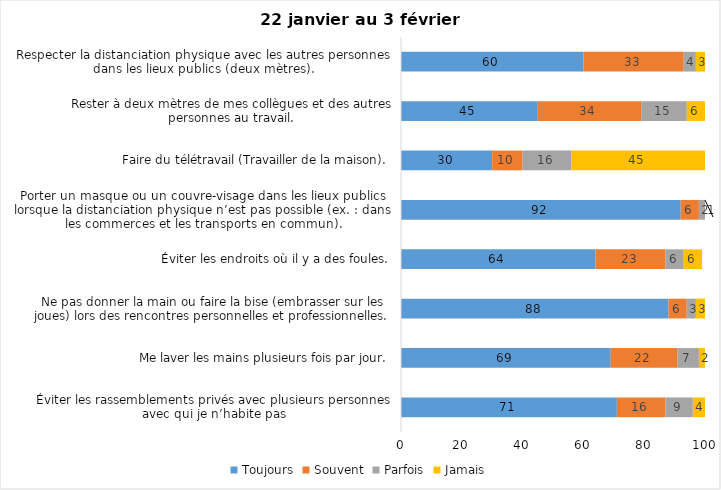
| Category | Toujours | Souvent | Parfois | Jamais |
|---|---|---|---|---|
| Éviter les rassemblements privés avec plusieurs personnes avec qui je n’habite pas | 71 | 16 | 9 | 4 |
| Me laver les mains plusieurs fois par jour. | 69 | 22 | 7 | 2 |
| Ne pas donner la main ou faire la bise (embrasser sur les joues) lors des rencontres personnelles et professionnelles. | 88 | 6 | 3 | 3 |
| Éviter les endroits où il y a des foules. | 64 | 23 | 6 | 6 |
| Porter un masque ou un couvre-visage dans les lieux publics lorsque la distanciation physique n’est pas possible (ex. : dans les commerces et les transports en commun). | 92 | 6 | 2 | 1 |
| Faire du télétravail (Travailler de la maison). | 30 | 10 | 16 | 45 |
| Rester à deux mètres de mes collègues et des autres personnes au travail. | 45 | 34 | 15 | 6 |
| Respecter la distanciation physique avec les autres personnes dans les lieux publics (deux mètres). | 60 | 33 | 4 | 3 |